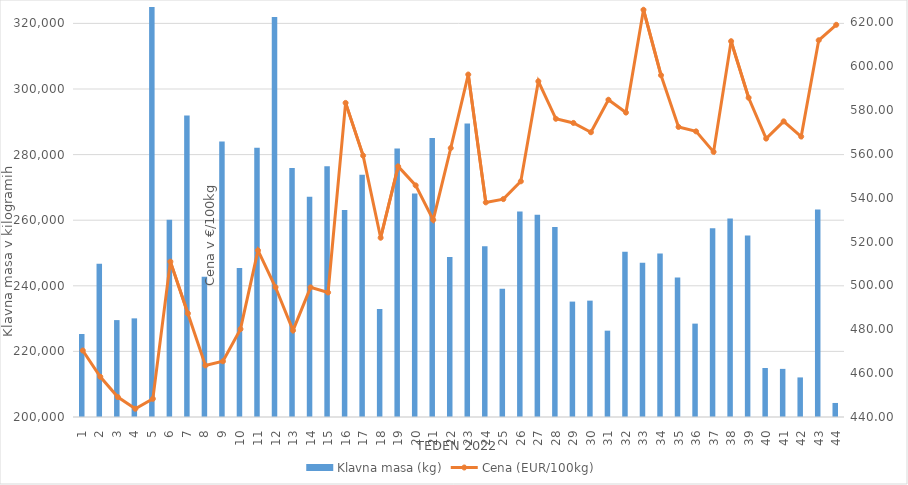
| Category | Klavna masa (kg) |
|---|---|
| 1.0 | 225300 |
| 2.0 | 246712 |
| 3.0 | 229541 |
| 4.0 | 230074 |
| 5.0 | 328640 |
| 6.0 | 260108 |
| 7.0 | 291887 |
| 8.0 | 242732 |
| 9.0 | 283987 |
| 10.0 | 245414 |
| 11.0 | 282092 |
| 12.0 | 321936 |
| 13.0 | 275950 |
| 14.0 | 267148 |
| 15.0 | 276417 |
| 16.0 | 263098 |
| 17.0 | 273824 |
| 18.0 | 232926 |
| 19.0 | 281859 |
| 20.0 | 268153 |
| 21.0 | 285073 |
| 22.0 | 248783 |
| 23.0 | 289478 |
| 24.0 | 252069 |
| 25.0 | 239099 |
| 26.0 | 262689 |
| 27.0 | 261656 |
| 28.0 | 257905 |
| 29.0 | 235185 |
| 30.0 | 235475 |
| 31.0 | 226322 |
| 32.0 | 250418 |
| 33.0 | 246996 |
| 34.0 | 249873 |
| 35.0 | 242516 |
| 36.0 | 228469 |
| 37.0 | 257511 |
| 38.0 | 260481 |
| 39.0 | 255370 |
| 40.0 | 214936 |
| 41.0 | 214672 |
| 42.0 | 212066 |
| 43.0 | 263287 |
| 44.0 | 204280 |